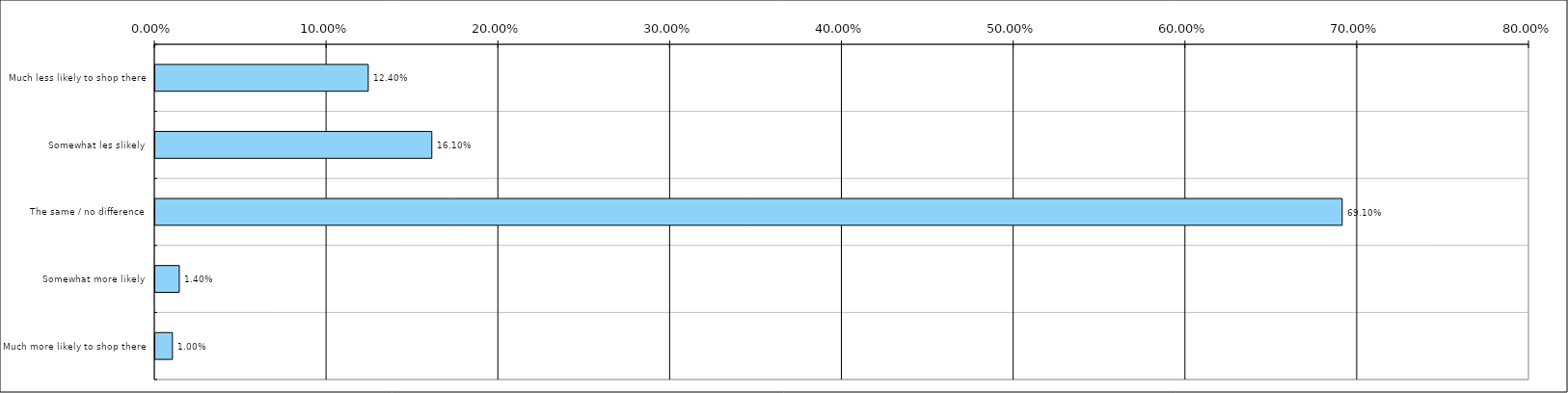
| Category | Total(United Kingdom) |
|---|---|
| Much less likely to shop there | 0.124 |
| Somewhat les slikely | 0.161 |
| The same / no difference | 0.691 |
| Somewhat more likely | 0.014 |
| Much more likely to shop there | 0.01 |